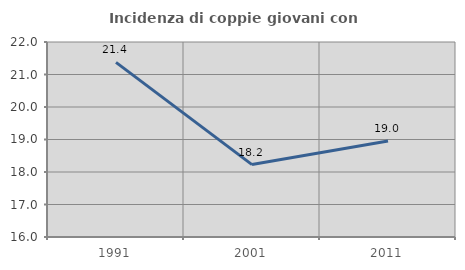
| Category | Incidenza di coppie giovani con figli |
|---|---|
| 1991.0 | 21.374 |
| 2001.0 | 18.228 |
| 2011.0 | 18.956 |